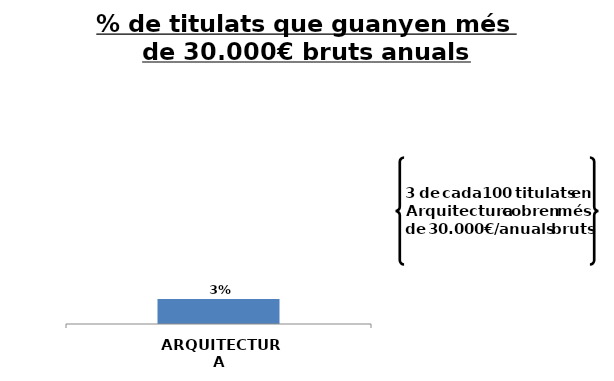
| Category | Series 0 |
|---|---|
| ARQUITECTURA | 0.032 |